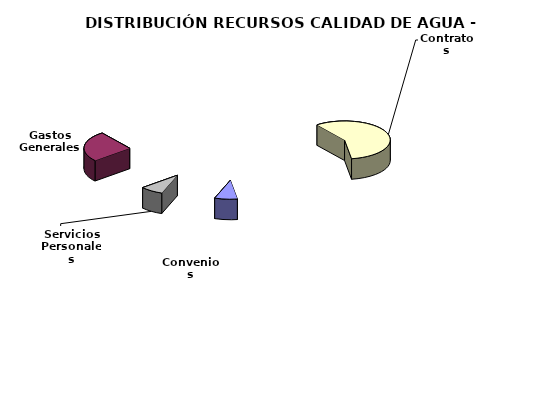
| Category | INICIAL |
|---|---|
| Servicios Personales | 76518165.138 |
| Gastos Generales | 243334622.98 |
| Contratos | 541552813 |
| Convenios | 75000000 |